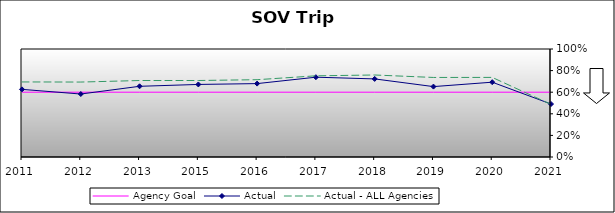
| Category | Agency Goal | Actual | Actual - ALL Agencies |
|---|---|---|---|
| 2011.0 | 0.6 | 0.626 | 0.695 |
| 2012.0 | 0.6 | 0.583 | 0.694 |
| 2013.0 | 0.6 | 0.655 | 0.708 |
| 2015.0 | 0.6 | 0.672 | 0.708 |
| 2016.0 | 0.6 | 0.68 | 0.716 |
| 2017.0 | 0.6 | 0.739 | 0.752 |
| 2018.0 | 0.6 | 0.723 | 0.759 |
| 2019.0 | 0.6 | 0.652 | 0.736 |
| 2020.0 | 0.6 | 0.693 | 0.737 |
| 2021.0 | 0.6 | 0.491 | 0.487 |